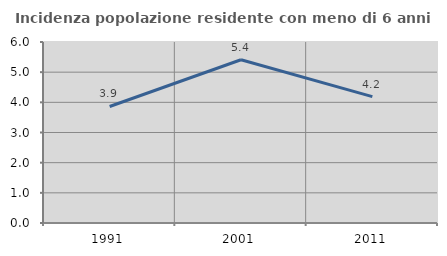
| Category | Incidenza popolazione residente con meno di 6 anni |
|---|---|
| 1991.0 | 3.862 |
| 2001.0 | 5.412 |
| 2011.0 | 4.191 |